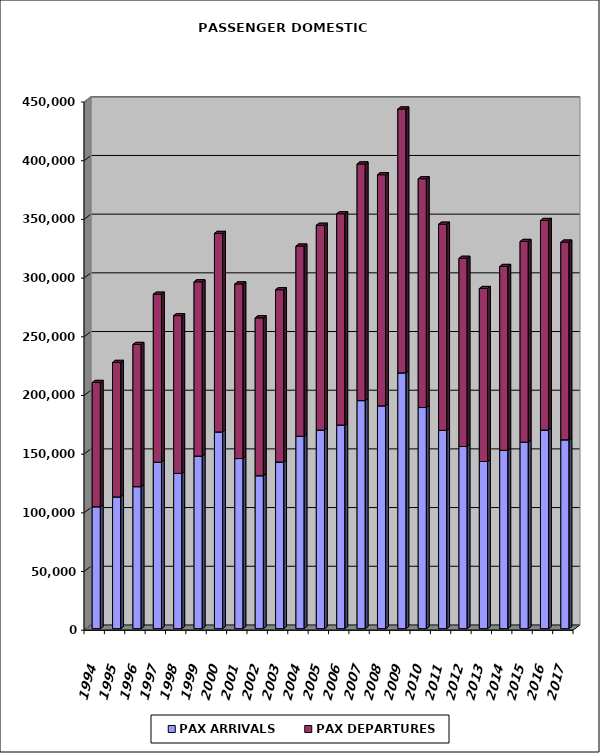
| Category | PAX ARRIVALS | PAX DEPARTURES |
|---|---|---|
| 1994.0 | 103837 | 105909 |
| 1995.0 | 112233 | 114583 |
| 1996.0 | 120971 | 121153 |
| 1997.0 | 141824 | 143102 |
| 1998.0 | 132259 | 134424 |
| 1999.0 | 147036 | 148488 |
| 2000.0 | 167611 | 169112 |
| 2001.0 | 144925 | 148763 |
| 2002.0 | 130292 | 134484 |
| 2003.0 | 141963 | 146797 |
| 2004.0 | 163896 | 162042 |
| 2005.0 | 169165 | 174511 |
| 2006.0 | 173442 | 180071 |
| 2007.0 | 194289 | 201597 |
| 2008.0 | 189840 | 196901 |
| 2009.0 | 217913 | 224830 |
| 2010.0 | 188384 | 194957 |
| 2011.0 | 169003 | 175577 |
| 2012.0 | 155168 | 160356 |
| 2013.0 | 142388 | 147404 |
| 2014.0 | 151913 | 156665 |
| 2015.0 | 158903 | 170995 |
| 2016.0 | 169204 | 178555 |
| 2017.0 | 160903 | 168422 |